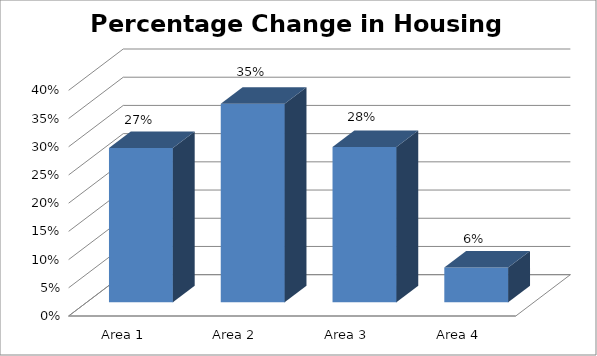
| Category | Series 0 |
|---|---|
| Area 1 | 0.273 |
| Area 2 | 0.352 |
| Area 3 | 0.275 |
| Area 4 | 0.061 |